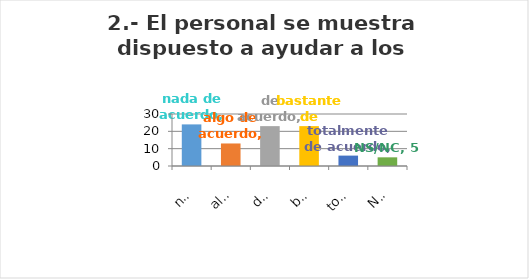
| Category | Series 0 |
|---|---|
| nada de acuerdo | 24 |
| algo de acuerdo | 13 |
| de acuerdo | 23 |
| bastante de acuerdo | 23 |
| totalmente de acuerdo | 6 |
| NS/NC | 5 |